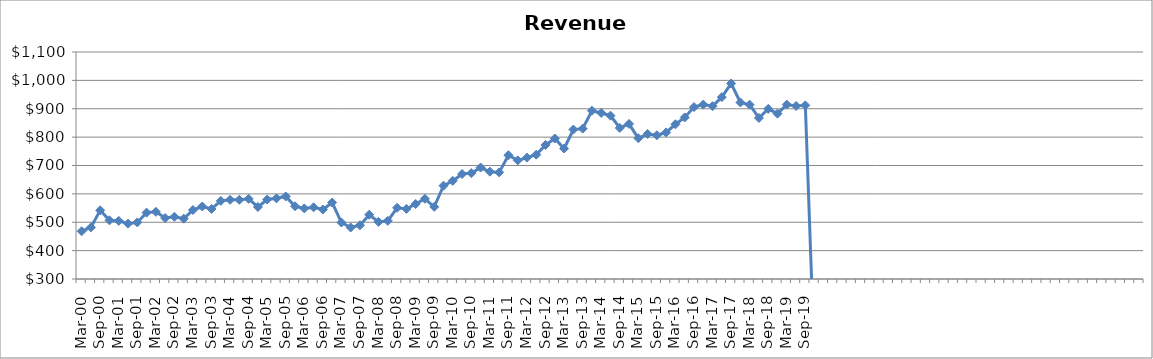
| Category | Revenue ($Millions) |
|---|---|
| Mar-00 | 468.293 |
| Jun-00 | 482.004 |
| Sep-00 | 542 |
| Dec-00 | 506.741 |
| Mar-01 | 504.872 |
| Jun-01 | 495.051 |
| Sep-01 | 499.404 |
| Dec-01 | 534.021 |
| Mar-02 | 536.762 |
| Jun-02 | 514.859 |
| Sep-02 | 519.234 |
| Dec-02 | 512.509 |
| Mar-03 | 543.114 |
| Jun-03 | 555.568 |
| Sep-03 | 546.822 |
| Dec-03 | 575.182 |
| Mar-04 | 579.08 |
| Jun-04 | 579.094 |
| Sep-04 | 582.54 |
| Dec-04 | 553.784 |
| Mar-05 | 580.046 |
| Jun-05 | 584.467 |
| Sep-05 | 590.959 |
| Dec-05 | 556.312 |
| Mar-06 | 548.743 |
| Jun-06 | 552.639 |
| Sep-06 | 544.898 |
| Dec-06 | 569.454 |
| Mar-07 | 499.032 |
| Jun-07 | 481.476 |
| Sep-07 | 489.438 |
| Dec-07 | 526.495 |
| Mar-08 | 501.323 |
| Jun-08 | 505.016 |
| Sep-08 | 550.931 |
| Dec-08 | 547.086 |
| Mar-09 | 564.308 |
| Jun-09 | 582.618 |
| Sep-09 | 554.43 |
| Dec-09 | 628.723 |
| Mar-10 | 645.863 |
| Jun-10 | 670.01 |
| Sep-10 | 673.154 |
| Dec-10 | 692.596 |
| Mar-11 | 678.301 |
| Jun-11 | 675.754 |
| Sep-11 | 736.223 |
| Dec-11 | 718.142 |
| Mar-12 | 727.844 |
| Jun-12 | 738.076 |
| Sep-12 | 772.483 |
| Dec-12 | 795.148 |
| Mar-13 | 759.838 |
| Jun-13 | 826.715 |
| Sep-13 | 829.877 |
| Dec-13 | 893.078 |
| Mar-14 | 885.152 |
| Jun-14 | 875.646 |
| Sep-14 | 832.282 |
| Dec-14 | 846.55 |
| Mar-15 | 795.998 |
| Jun-15 | 811.196 |
| Sep-15 | 806.654 |
| Dec-15 | 816.366 |
| Mar-16 | 845.294 |
| Jun-16 | 869.416 |
| Sep-16 | 906.09 |
| Dec-16 | 914.823 |
| Mar-17 | 909.084 |
| Jun-17 | 940.838 |
| Sep-17 | 989.014 |
| Dec-17 | 922.186 |
| Mar-18 | 914.244 |
| Jun-18 | 867.472 |
| Sep-18 | 899.672 |
| Dec-18 | 882.753 |
| Mar-19 | 914.741 |
| Jun-19 | 909.773 |
| Sep-19 | 911.95 |